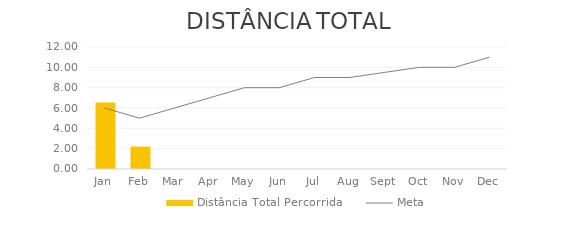
| Category | Distância Total Percorrida |
|---|---|
| 2012-01-01 | 6.55 |
| 2012-02-01 | 2.2 |
| 2012-03-01 | 0 |
| 2012-04-01 | 0 |
| 2012-05-01 | 0 |
| 2012-06-01 | 0 |
| 2012-07-01 | 0 |
| 2012-08-01 | 0 |
| 2012-09-01 | 0 |
| 2012-10-01 | 0 |
| 2012-11-01 | 0 |
| 2012-12-01 | 0 |